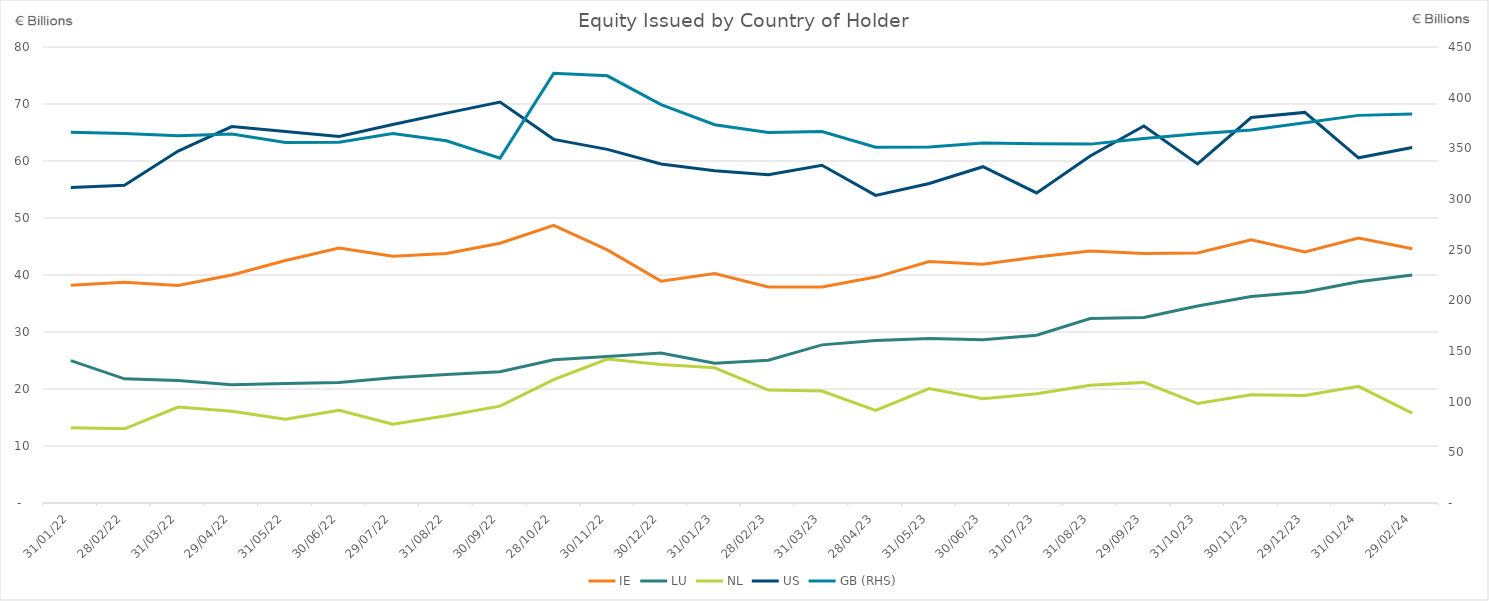
| Category | IE | LU | NL | US |
|---|---|---|---|---|
| 2022-01-31 | 38.188 | 24.98 | 13.2 | 55.338 |
| 2022-02-28 | 38.722 | 21.779 | 13.016 | 55.744 |
| 2022-03-31 | 38.166 | 21.502 | 16.839 | 61.736 |
| 2022-04-29 | 40.005 | 20.731 | 16.096 | 66.032 |
| 2022-05-31 | 42.553 | 20.969 | 14.714 | 65.157 |
| 2022-06-30 | 44.735 | 21.129 | 16.257 | 64.309 |
| 2022-07-29 | 43.293 | 21.984 | 13.815 | 66.414 |
| 2022-08-31 | 43.761 | 22.524 | 15.31 | 68.4 |
| 2022-09-30 | 45.579 | 23.046 | 16.99 | 70.341 |
| 2022-10-28 | 48.696 | 25.117 | 21.66 | 63.798 |
| 2022-11-30 | 44.406 | 25.709 | 25.244 | 62.036 |
| 2022-12-30 | 38.927 | 26.318 | 24.296 | 59.466 |
| 2023-01-31 | 40.264 | 24.511 | 23.726 | 58.294 |
| 2023-02-28 | 37.888 | 25.056 | 19.812 | 57.603 |
| 2023-03-31 | 37.89 | 27.744 | 19.647 | 59.25 |
| 2023-04-28 | 39.632 | 28.502 | 16.232 | 53.973 |
| 2023-05-31 | 42.363 | 28.865 | 20.084 | 56.058 |
| 2023-06-30 | 41.903 | 28.656 | 18.31 | 59 |
| 2023-07-31 | 43.157 | 29.446 | 19.17 | 54.4 |
| 2023-08-31 | 44.222 | 32.365 | 20.667 | 60.871 |
| 2023-09-29 | 43.777 | 32.557 | 21.162 | 66.149 |
| 2023-10-31 | 43.863 | 34.553 | 17.448 | 59.491 |
| 2023-11-30 | 46.188 | 36.21 | 18.998 | 67.628 |
| 2023-12-29 | 44.059 | 37.005 | 18.848 | 68.528 |
| 2024-01-31 | 46.494 | 38.805 | 20.47 | 60.556 |
| 2024-02-29 | 44.607 | 40.019 | 15.773 | 62.376 |